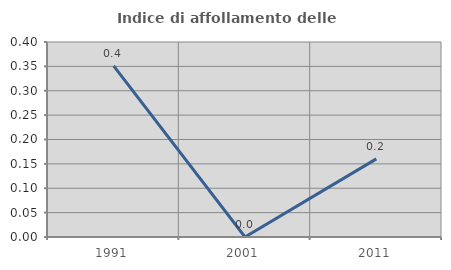
| Category | Indice di affollamento delle abitazioni  |
|---|---|
| 1991.0 | 0.351 |
| 2001.0 | 0 |
| 2011.0 | 0.16 |